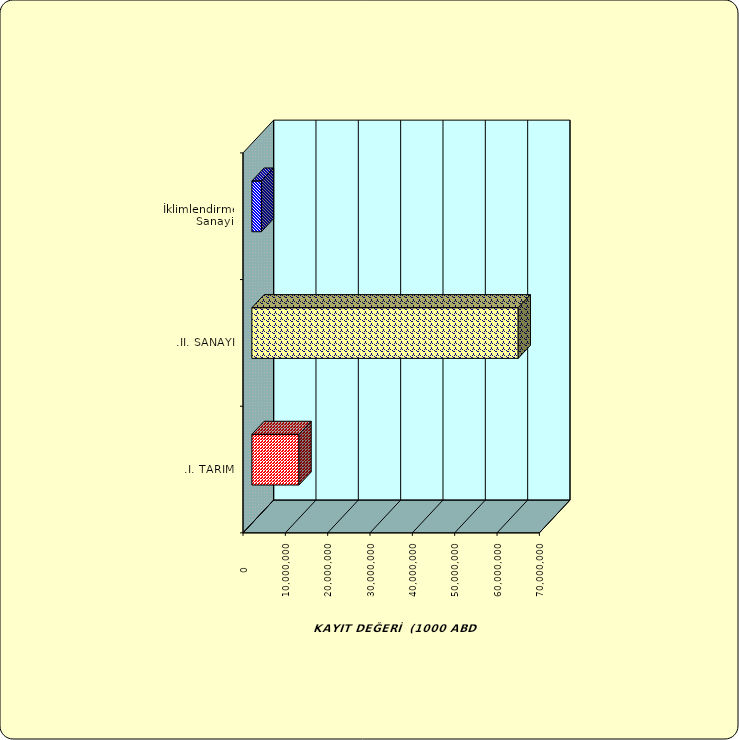
| Category | Series 0 |
|---|---|
| .I. TARIM | 11127021.077 |
| .II. SANAYİ | 62902421.276 |
|  İklimlendirme Sanayii | 2249686.265 |